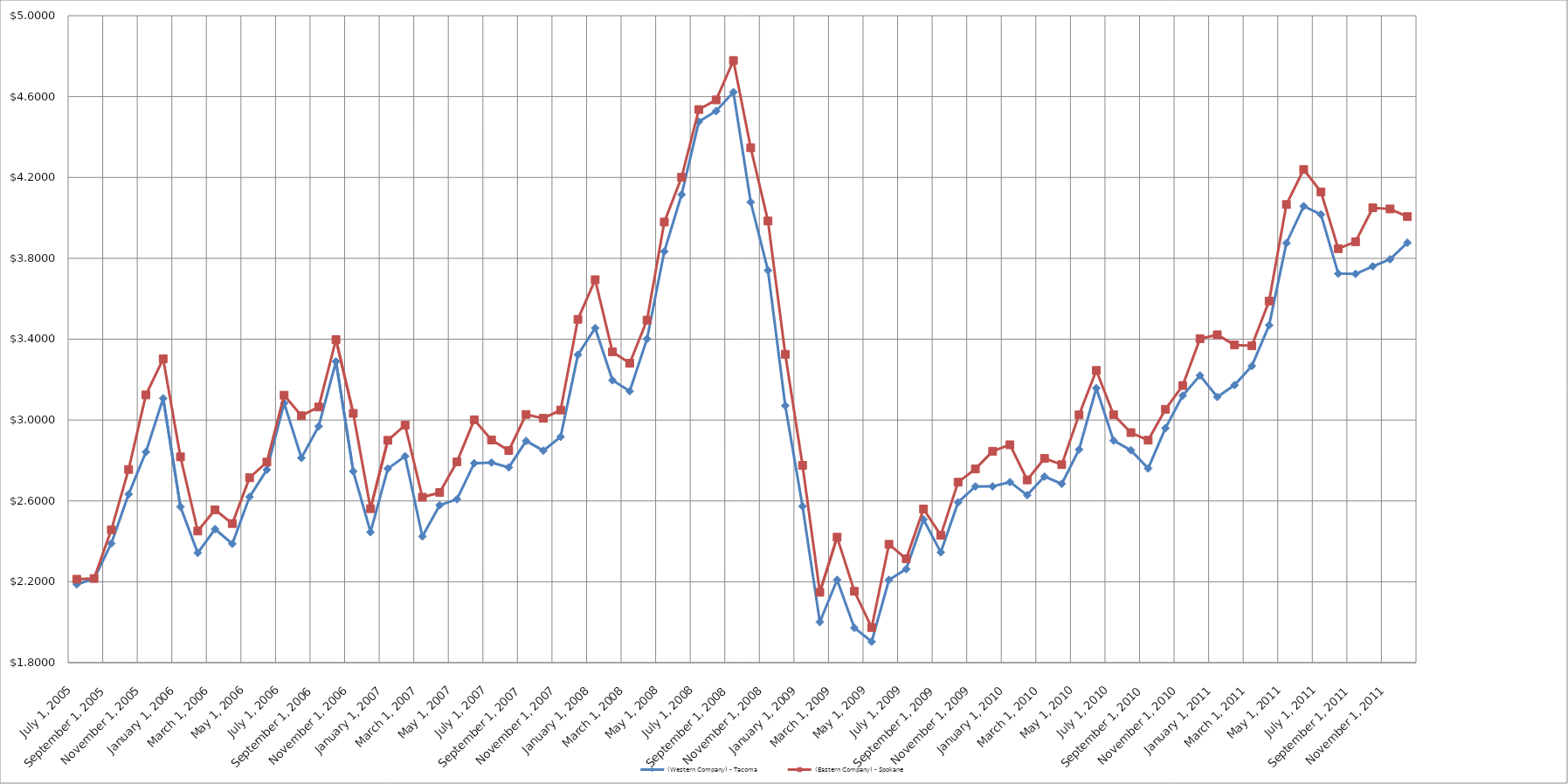
| Category | (Western Company) - Tacoma | (Eastern Company) - Spokane |
|---|---|---|
| 2005-07-01 | 2.188 | 2.213 |
| 2005-08-01 | 2.215 | 2.216 |
| 2005-09-01 | 2.39 | 2.457 |
| 2005-10-01 | 2.633 | 2.756 |
| 2005-11-01 | 2.842 | 3.124 |
| 2005-12-01 | 3.107 | 3.303 |
| 2006-01-01 | 2.571 | 2.818 |
| 2006-02-01 | 2.343 | 2.451 |
| 2006-03-01 | 2.461 | 2.556 |
| 2006-04-01 | 2.388 | 2.488 |
| 2006-05-01 | 2.62 | 2.715 |
| 2006-06-01 | 2.754 | 2.792 |
| 2006-07-01 | 3.084 | 3.123 |
| 2006-08-01 | 2.813 | 3.021 |
| 2006-09-01 | 2.969 | 3.064 |
| 2006-10-01 | 3.29 | 3.398 |
| 2006-11-01 | 2.746 | 3.033 |
| 2006-12-01 | 2.446 | 2.562 |
| 2007-01-01 | 2.76 | 2.9 |
| 2007-02-01 | 2.821 | 2.975 |
| 2007-03-01 | 2.424 | 2.618 |
| 2007-04-01 | 2.579 | 2.642 |
| 2007-05-01 | 2.608 | 2.793 |
| 2007-06-01 | 2.786 | 3.001 |
| 2007-07-01 | 2.79 | 2.902 |
| 2007-08-01 | 2.766 | 2.849 |
| 2007-09-01 | 2.896 | 3.028 |
| 2007-10-01 | 2.849 | 3.009 |
| 2007-11-01 | 2.917 | 3.049 |
| 2007-12-01 | 3.323 | 3.498 |
| 2008-01-01 | 3.455 | 3.694 |
| 2008-02-01 | 3.197 | 3.337 |
| 2008-03-01 | 3.143 | 3.281 |
| 2008-04-01 | 3.401 | 3.494 |
| 2008-05-01 | 3.834 | 3.979 |
| 2008-06-01 | 4.115 | 4.201 |
| 2008-07-01 | 4.476 | 4.536 |
| 2008-08-01 | 4.528 | 4.584 |
| 2008-09-01 | 4.622 | 4.778 |
| 2008-10-01 | 4.078 | 4.347 |
| 2008-11-01 | 3.74 | 3.985 |
| 2008-12-01 | 3.071 | 3.325 |
| 2009-01-01 | 2.573 | 2.776 |
| 2009-02-01 | 2.001 | 2.148 |
| 2009-03-01 | 2.21 | 2.42 |
| 2009-04-01 | 1.972 | 2.153 |
| 2009-05-01 | 1.904 | 1.974 |
| 2009-06-01 | 2.209 | 2.386 |
| 2009-07-01 | 2.263 | 2.314 |
| 2009-08-01 | 2.508 | 2.56 |
| 2009-09-01 | 2.346 | 2.43 |
| 2009-10-01 | 2.593 | 2.693 |
| 2009-11-01 | 2.671 | 2.758 |
| 2009-12-01 | 2.672 | 2.846 |
| 2010-01-01 | 2.693 | 2.878 |
| 2010-02-01 | 2.629 | 2.704 |
| 2010-03-01 | 2.721 | 2.81 |
| 2010-04-01 | 2.684 | 2.78 |
| 2010-05-01 | 2.854 | 3.025 |
| 2010-06-01 | 3.157 | 3.245 |
| 2010-07-01 | 2.898 | 3.026 |
| 2010-08-01 | 2.851 | 2.938 |
| 2010-09-01 | 2.76 | 2.9 |
| 2010-10-01 | 2.96 | 3.053 |
| 2010-11-01 | 3.121 | 3.171 |
| 2010-12-01 | 3.221 | 3.403 |
| 2011-01-01 | 3.114 | 3.422 |
| 2011-02-01 | 3.173 | 3.371 |
| 2011-03-01 | 3.267 | 3.367 |
| 2011-04-01 | 3.469 | 3.589 |
| 2011-05-01 | 3.875 | 4.066 |
| 2011-06-01 | 4.058 | 4.239 |
| 2011-07-01 | 4.017 | 4.129 |
| 2011-08-01 | 3.725 | 3.848 |
| 2011-09-01 | 3.723 | 3.882 |
| 2011-10-01 | 3.76 | 4.05 |
| 2011-11-01 | 3.795 | 4.044 |
| 2011-12-01 | 3.877 | 4.006 |